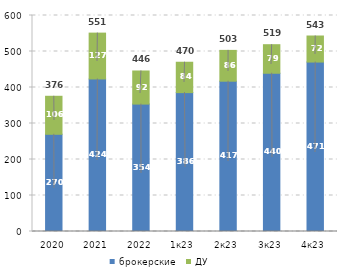
| Category | брокерские | ДУ |
|---|---|---|
| 2020 | 270.015 | 105.606 |
| 2021 | 423.739 | 127.35 |
| 2022 | 353.897 | 91.953 |
| 1к23 | 385.764 | 84.396 |
| 2к23 | 417.483 | 85.596 |
| 3к23 | 439.559 | 79.359 |
| 4к23 | 470.661 | 72.373 |